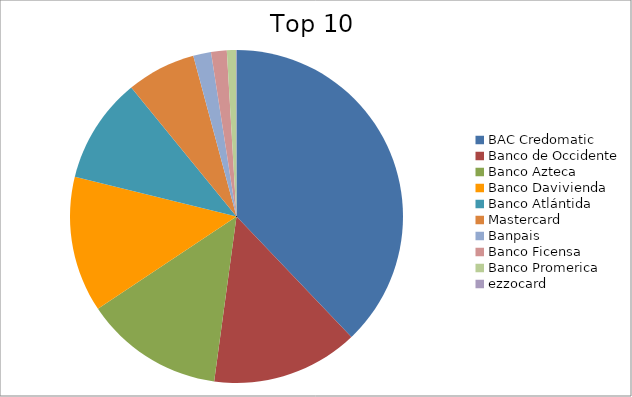
| Category | Series 0 |
|---|---|
| BAC Credomatic | 37.88 |
| Banco de Occidente | 14.26 |
| Banco Azteca | 13.5 |
| Banco Davivienda | 13.2 |
| Banco Atlántida | 10.26 |
| Mastercard | 6.71 |
| Banpais | 1.73 |
| Banco Ficensa | 1.52 |
| Banco Promerica | 0.88 |
| ezzocard | 0.05 |